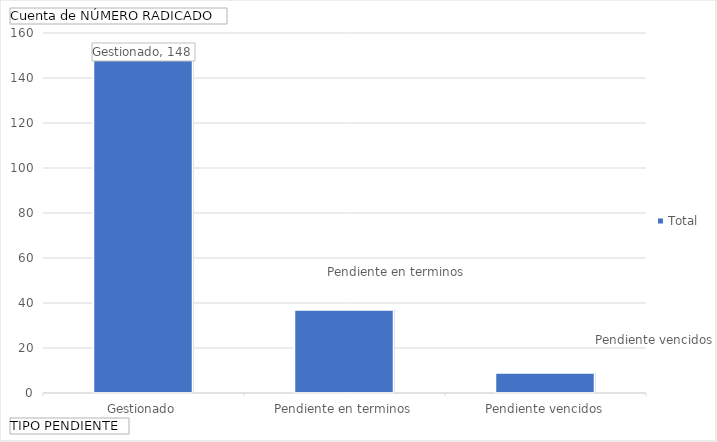
| Category | Total |
|---|---|
| Gestionado | 148 |
| Pendiente en terminos | 37 |
| Pendiente vencidos | 9 |